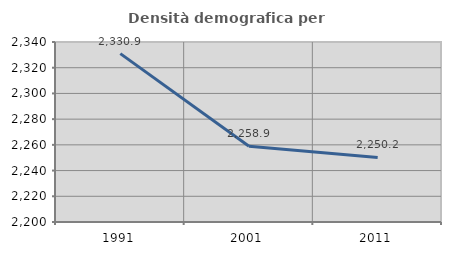
| Category | Densità demografica |
|---|---|
| 1991.0 | 2330.939 |
| 2001.0 | 2258.917 |
| 2011.0 | 2250.196 |